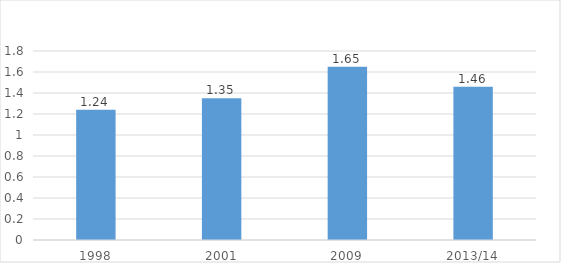
| Category | Antall daglige reiser  |
|---|---|
| 1998 | 1.24 |
| 2001 | 1.35 |
| 2009 | 1.65 |
| 2013/14 | 1.46 |